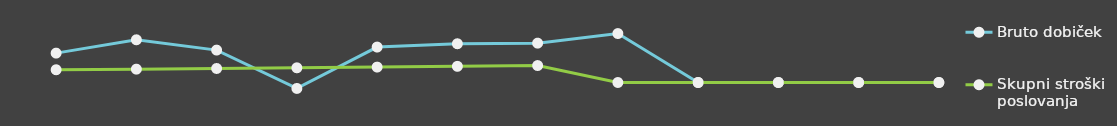
| Category | Bruto dobiček | Skupni stroški poslovanja |
|---|---|---|
| 0 | 25000 | 10841 |
| 1 | 36348 | 11367.25 |
| 2 | 27562 | 11919.82 |
| 3 | -5059.5 | 12500.01 |
| 4 | 30153.18 | 13109.21 |
| 5 | 32964.45 | 13748.86 |
| 6 | 33502.87 | 14420.51 |
| 7 | 41646 | 0 |
| 8 | 0 | 0 |
| 9 | 0 | 0 |
| 10 | 0 | 0 |
| 11 | 0 | 0 |